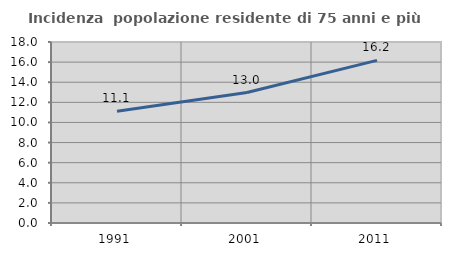
| Category | Incidenza  popolazione residente di 75 anni e più |
|---|---|
| 1991.0 | 11.111 |
| 2001.0 | 12.972 |
| 2011.0 | 16.173 |